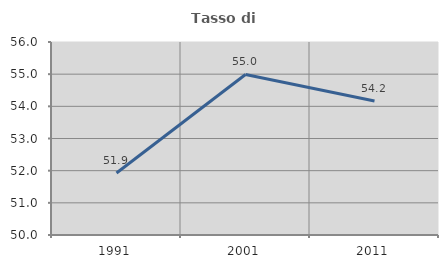
| Category | Tasso di occupazione   |
|---|---|
| 1991.0 | 51.926 |
| 2001.0 | 54.99 |
| 2011.0 | 54.167 |